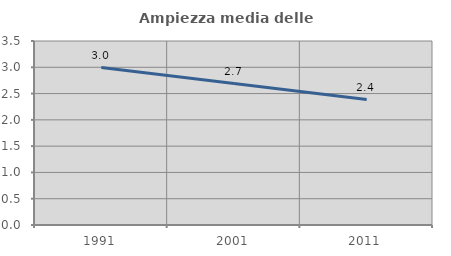
| Category | Ampiezza media delle famiglie |
|---|---|
| 1991.0 | 2.995 |
| 2001.0 | 2.691 |
| 2011.0 | 2.386 |